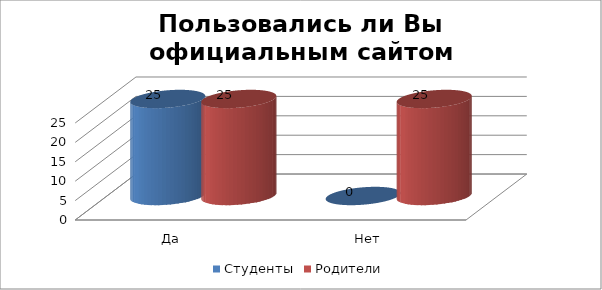
| Category | Студенты | Родители |
|---|---|---|
| Да | 25 | 25 |
| Нет | 0 | 25 |